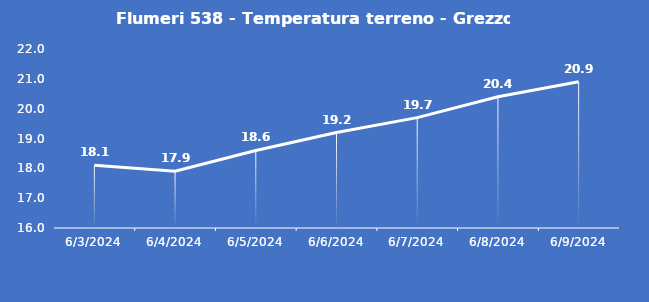
| Category | Flumeri 538 - Temperatura terreno - Grezzo (°C) |
|---|---|
| 6/3/24 | 18.1 |
| 6/4/24 | 17.9 |
| 6/5/24 | 18.6 |
| 6/6/24 | 19.2 |
| 6/7/24 | 19.7 |
| 6/8/24 | 20.4 |
| 6/9/24 | 20.9 |